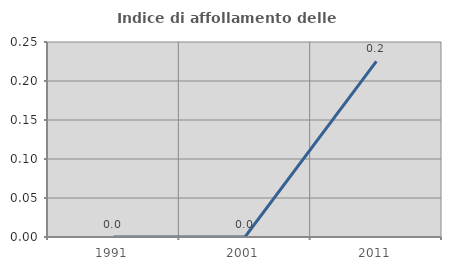
| Category | Indice di affollamento delle abitazioni  |
|---|---|
| 1991.0 | 0 |
| 2001.0 | 0 |
| 2011.0 | 0.225 |